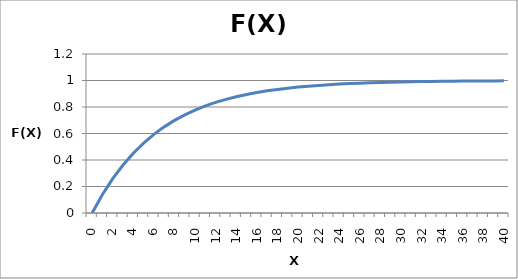
| Category | Series 0 |
|---|---|
| 0.0 | 0 |
| 1.0 | 0.139 |
| 2.0 | 0.259 |
| 3.0 | 0.362 |
| 4.0 | 0.451 |
| 5.0 | 0.528 |
| 6.0 | 0.593 |
| 7.0 | 0.65 |
| 8.0 | 0.699 |
| 9.0 | 0.741 |
| 10.0 | 0.777 |
| 11.0 | 0.808 |
| 12.0 | 0.835 |
| 13.0 | 0.858 |
| 14.0 | 0.878 |
| 15.0 | 0.895 |
| 16.0 | 0.909 |
| 17.0 | 0.922 |
| 18.0 | 0.933 |
| 19.0 | 0.942 |
| 20.0 | 0.95 |
| 21.0 | 0.957 |
| 22.0 | 0.963 |
| 23.0 | 0.968 |
| 24.0 | 0.973 |
| 25.0 | 0.976 |
| 26.0 | 0.98 |
| 27.0 | 0.983 |
| 28.0 | 0.985 |
| 29.0 | 0.987 |
| 30.0 | 0.989 |
| 31.0 | 0.99 |
| 32.0 | 0.992 |
| 33.0 | 0.993 |
| 34.0 | 0.994 |
| 35.0 | 0.995 |
| 36.0 | 0.995 |
| 37.0 | 0.996 |
| 38.0 | 0.997 |
| 39.0 | 0.997 |
| 40.0 | 0.998 |